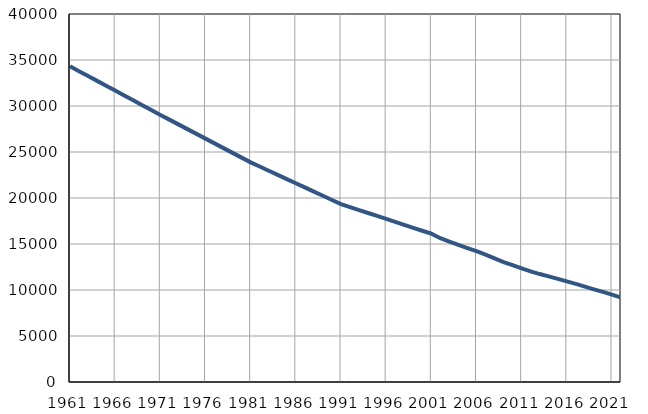
| Category | Population
size |
|---|---|
| 1961.0 | 34316 |
| 1962.0 | 33788 |
| 1963.0 | 33259 |
| 1964.0 | 32731 |
| 1965.0 | 32203 |
| 1966.0 | 31675 |
| 1967.0 | 31146 |
| 1968.0 | 30618 |
| 1969.0 | 30090 |
| 1970.0 | 29561 |
| 1971.0 | 29033 |
| 1972.0 | 28517 |
| 1973.0 | 28001 |
| 1974.0 | 27485 |
| 1975.0 | 26969 |
| 1976.0 | 26453 |
| 1977.0 | 25936 |
| 1978.0 | 25420 |
| 1979.0 | 24905 |
| 1980.0 | 24388 |
| 1981.0 | 23872 |
| 1982.0 | 23418 |
| 1983.0 | 22964 |
| 1984.0 | 22510 |
| 1985.0 | 22056 |
| 1986.0 | 21602 |
| 1987.0 | 21149 |
| 1988.0 | 20695 |
| 1989.0 | 20241 |
| 1990.0 | 19787 |
| 1991.0 | 19333 |
| 1992.0 | 19012 |
| 1993.0 | 18691 |
| 1994.0 | 18369 |
| 1995.0 | 18048 |
| 1996.0 | 17726 |
| 1997.0 | 17405 |
| 1998.0 | 17084 |
| 1999.0 | 16763 |
| 2000.0 | 16441 |
| 2001.0 | 16120 |
| 2002.0 | 15626 |
| 2003.0 | 15255 |
| 2004.0 | 14896 |
| 2005.0 | 14552 |
| 2006.0 | 14222 |
| 2007.0 | 13849 |
| 2008.0 | 13436 |
| 2009.0 | 13036 |
| 2010.0 | 12696 |
| 2011.0 | 12352 |
| 2012.0 | 12025 |
| 2013.0 | 11734 |
| 2014.0 | 11478 |
| 2015.0 | 11210 |
| 2016.0 | 10933 |
| 2017.0 | 10659 |
| 2018.0 | 10362 |
| 2019.0 | 10069 |
| 2020.0 | 9789 |
| 2021.0 | 9497 |
| 2022.0 | 9177 |